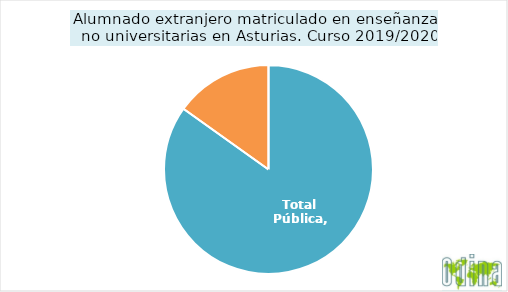
| Category | Series 0 |
|---|---|
| Total Pública | 6439 |
| Total Privada | 1148 |